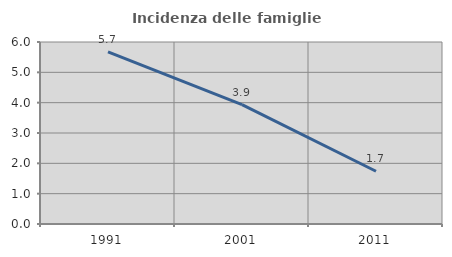
| Category | Incidenza delle famiglie numerose |
|---|---|
| 1991.0 | 5.674 |
| 2001.0 | 3.937 |
| 2011.0 | 1.739 |